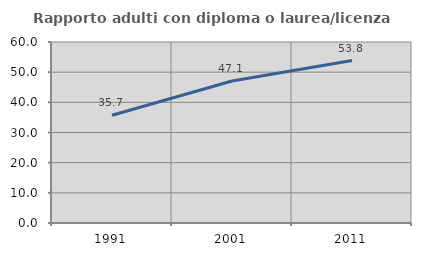
| Category | Rapporto adulti con diploma o laurea/licenza media  |
|---|---|
| 1991.0 | 35.714 |
| 2001.0 | 47.059 |
| 2011.0 | 53.846 |